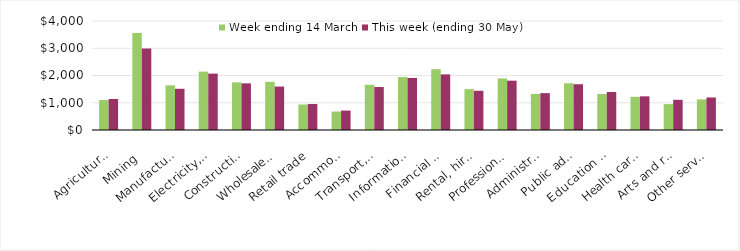
| Category | Week ending 14 March | This week (ending 30 May) |
|---|---|---|
| Agriculture, forestry and fishing | 1099.14 | 1136.76 |
| Mining | 3558.21 | 2991.24 |
| Manufacturing | 1638.63 | 1511.93 |
| Electricity, gas, water and waste services | 2141.4 | 2069.26 |
| Construction | 1748.69 | 1711.98 |
| Wholesale trade | 1767.66 | 1594.9 |
| Retail trade | 935.02 | 955.55 |
| Accommodation and food services | 678.02 | 712.99 |
| Transport, postal and warehousing | 1659.23 | 1578.22 |
| Information media and telecommunications | 1943.31 | 1909.99 |
| Financial and insurance services | 2231.84 | 2040.7 |
| Rental, hiring and real estate services | 1500.21 | 1439.92 |
| Professional, scientific and technical services | 1891.16 | 1810.49 |
| Administrative and support services | 1323.55 | 1353.24 |
| Public administration and safety | 1714.15 | 1679.99 |
| Education and training | 1320.43 | 1395.35 |
| Health care and social assistance | 1218.39 | 1235.34 |
| Arts and recreation services | 949.83 | 1107.72 |
| Other services | 1122.52 | 1193.39 |